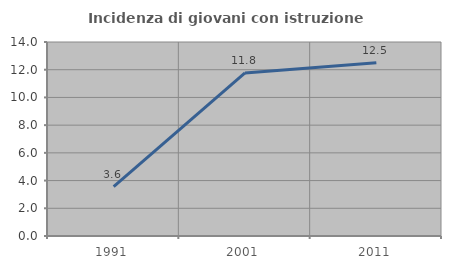
| Category | Incidenza di giovani con istruzione universitaria |
|---|---|
| 1991.0 | 3.571 |
| 2001.0 | 11.765 |
| 2011.0 | 12.5 |